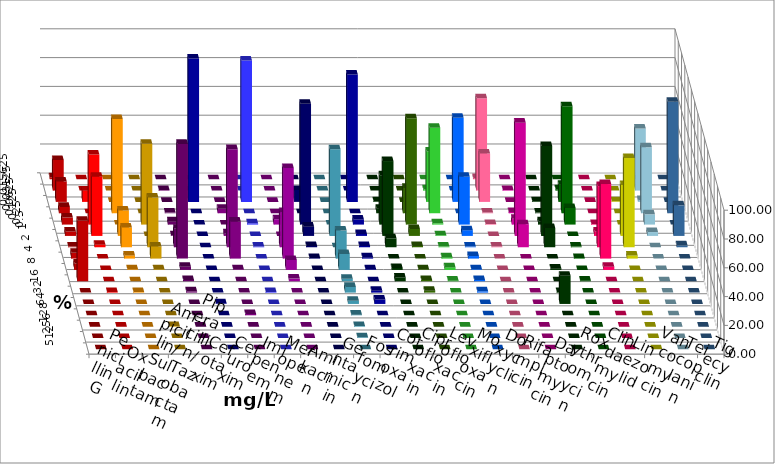
| Category | Penicillin G | Oxacillin | Ampicillin/ Sulbactam | Piperacillin/ Tazobactam | Cefotaxim | Cefuroxim | Imipenem | Meropenem | Amikacin | Gentamicin | Fosfomycin | Cotrimoxazol | Ciprofloxacin | Levofloxacin | Moxifloxacin | Doxycyclin | Rifampicin | Daptomycin | Roxythromycin | Clindamycin | Linezolid | Vancomycin | Teicoplanin | Tigecyclin |
|---|---|---|---|---|---|---|---|---|---|---|---|---|---|---|---|---|---|---|---|---|---|---|---|---|
| 0.015625 | 1.327 | 0 | 0 | 0 | 0 | 0 | 0 | 0 | 0 | 0 | 0 | 0 | 0 | 0 | 0 | 0 | 0.885 | 0 | 0 | 0 | 0 | 0 | 0 | 0 |
| 0.03125 | 21.239 | 0 | 0 | 0 | 0.442 | 0 | 0 | 0 | 0 | 0 | 0 | 0 | 0 | 0 | 0.885 | 0 | 64.159 | 0.444 | 0 | 0.885 | 0 | 0 | 0 | 43.111 |
| 0.0625 | 14.159 | 7.965 | 0 | 0 | 0 | 0 | 99.558 | 98.23 | 0 | 8.295 | 0 | 88.444 | 0.444 | 0 | 34.956 | 58.407 | 33.628 | 0 | 0.446 | 11.947 | 0 | 0.442 | 0 | 1.333 |
| 0.125 | 4.425 | 0 | 65.487 | 0 | 0.442 | 3.097 | 0 | 0 | 0 | 0 | 0 | 0 | 3.111 | 17.699 | 59.292 | 0 | 0.442 | 0.889 | 0.446 | 74.336 | 0 | 0 | 77.434 | 45.778 |
| 0.25 | 4.867 | 48.673 | 0 | 56.195 | 2.212 | 0 | 0 | 0.885 | 3.704 | 83.871 | 0 | 3.556 | 34.222 | 73.894 | 0.885 | 33.186 | 0.442 | 4 | 2.232 | 11.504 | 0.442 | 0 | 0 | 7.111 |
| 0.5 | 3.097 | 41.15 | 17.699 | 0 | 0.442 | 1.77 | 0 | 0 | 0 | 6.452 | 60.177 | 1.333 | 52 | 4.867 | 0.442 | 3.982 | 0 | 78.667 | 62.5 | 0 | 3.097 | 35.398 | 21.239 | 2.667 |
| 1.0 | 0.442 | 1.77 | 13.717 | 34.513 | 12.832 | 68.142 | 0 | 0.442 | 24.537 | 0.922 | 0 | 0.889 | 6.222 | 0.885 | 0.442 | 0.442 | 0.442 | 16 | 13.393 | 0.442 | 42.478 | 61.947 | 1.327 | 0 |
| 2.0 | 3.982 | 0 | 2.212 | 8.407 | 79.646 | 25.664 | 0 | 0 | 62.963 | 0.461 | 19.469 | 0.889 | 0 | 0 | 0.885 | 1.77 | 0 | 0 | 0 | 0.442 | 51.77 | 2.212 | 0 | 0 |
| 4.0 | 4.425 | 0 | 0.442 | 0.442 | 2.212 | 0.442 | 0 | 0 | 6.944 | 0 | 11.062 | 0.444 | 1.333 | 0.442 | 1.77 | 0.442 | 0 | 0 | 0.893 | 0 | 2.212 | 0 | 0 | 0 |
| 8.0 | 42.035 | 0 | 0 | 0 | 0.885 | 0 | 0 | 0 | 1.852 | 0 | 1.77 | 0 | 2.667 | 0.885 | 0.442 | 0.885 | 0 | 0 | 0 | 0.442 | 0 | 0 | 0 | 0 |
| 16.0 | 0 | 0.442 | 0.442 | 0 | 0.885 | 0 | 0 | 0.442 | 0 | 0 | 3.982 | 1.333 | 0 | 1.327 | 0 | 0.885 | 0 | 0 | 0.446 | 0 | 0 | 0 | 0 | 0 |
| 32.0 | 0 | 0 | 0 | 0 | 0 | 0 | 0.442 | 0 | 0 | 0 | 2.212 | 3.111 | 0 | 0 | 0 | 0 | 0 | 0 | 19.643 | 0 | 0 | 0 | 0 | 0 |
| 64.0 | 0 | 0 | 0 | 0 | 0 | 0.885 | 0 | 0 | 0 | 0 | 0.442 | 0 | 0 | 0 | 0 | 0 | 0 | 0 | 0 | 0 | 0 | 0 | 0 | 0 |
| 128.0 | 0 | 0 | 0 | 0.442 | 0 | 0 | 0 | 0 | 0 | 0 | 0.442 | 0 | 0 | 0 | 0 | 0 | 0 | 0 | 0 | 0 | 0 | 0 | 0 | 0 |
| 256.0 | 0 | 0 | 0 | 0 | 0 | 0 | 0 | 0 | 0 | 0 | 0.442 | 0 | 0 | 0 | 0 | 0 | 0 | 0 | 0 | 0 | 0 | 0 | 0 | 0 |
| 512.0 | 0 | 0 | 0 | 0 | 0 | 0 | 0 | 0 | 0 | 0 | 0 | 0 | 0 | 0 | 0 | 0 | 0 | 0 | 0 | 0 | 0 | 0 | 0 | 0 |